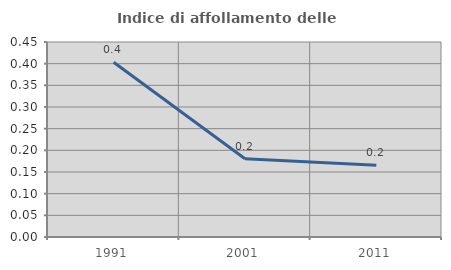
| Category | Indice di affollamento delle abitazioni  |
|---|---|
| 1991.0 | 0.403 |
| 2001.0 | 0.181 |
| 2011.0 | 0.166 |